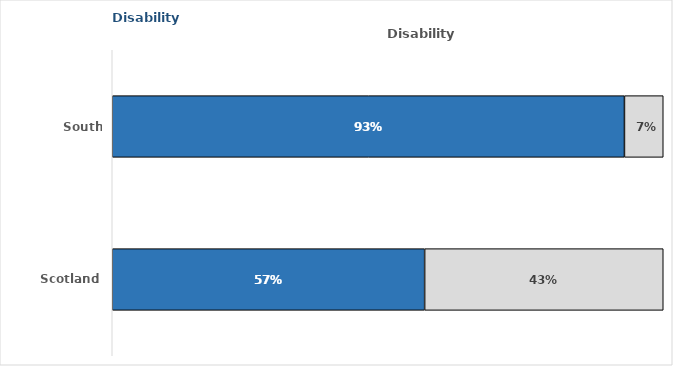
| Category | Disability | No Disability |
|---|---|---|
| South Ayrshire | 0.93 | 0.07 |
| Scotland | 0.567 | 0.433 |